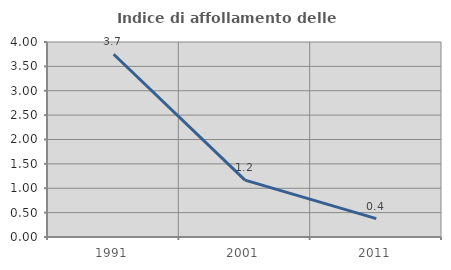
| Category | Indice di affollamento delle abitazioni  |
|---|---|
| 1991.0 | 3.748 |
| 2001.0 | 1.167 |
| 2011.0 | 0.377 |